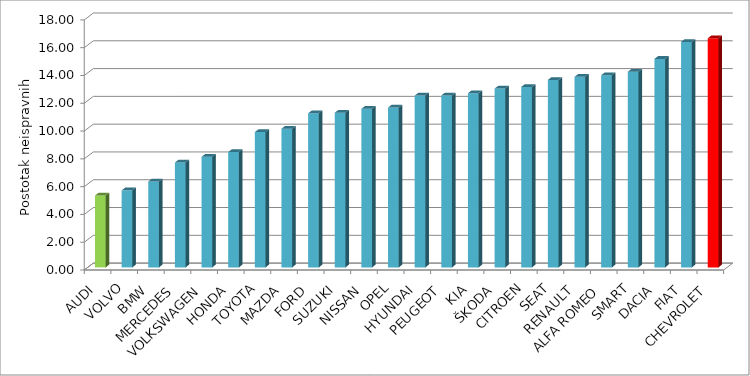
| Category | Series 4 |
|---|---|
| AUDI | 5.172 |
| VOLVO | 5.544 |
| BMW | 6.187 |
| MERCEDES | 7.549 |
| VOLKSWAGEN | 7.958 |
| HONDA | 8.301 |
| TOYOTA | 9.738 |
| MAZDA | 9.98 |
| FORD | 11.087 |
| SUZUKI | 11.132 |
| NISSAN | 11.415 |
| OPEL | 11.507 |
| HYUNDAI | 12.366 |
| PEUGEOT | 12.375 |
| KIA | 12.537 |
| ŠKODA | 12.87 |
| CITROEN | 12.989 |
| SEAT | 13.493 |
| RENAULT | 13.714 |
| ALFA ROMEO | 13.828 |
| SMART | 14.081 |
| DACIA | 15.005 |
| FIAT | 16.227 |
| CHEVROLET | 16.488 |